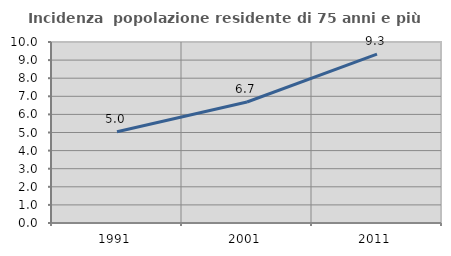
| Category | Incidenza  popolazione residente di 75 anni e più |
|---|---|
| 1991.0 | 5.045 |
| 2001.0 | 6.686 |
| 2011.0 | 9.327 |